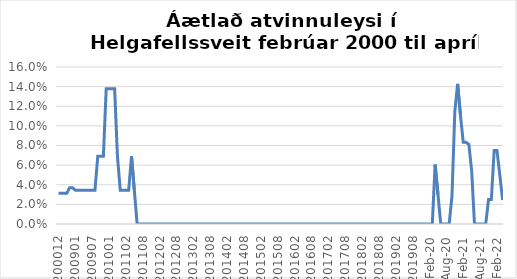
| Category | Áætlað atvinnuleysi |
|---|---|
| 200012 | 0.031 |
| 200301 | 0.031 |
| 200302 | 0.031 |
| 200303 | 0.031 |
| 200501 | 0.037 |
| 200502 | 0.037 |
| 200901 | 0.034 |
| 200902 | 0.034 |
| 200903 | 0.034 |
| 200904 | 0.034 |
| 200905 | 0.034 |
| 200906 | 0.034 |
| 200907 | 0.034 |
| 200908 | 0.034 |
| 200909 | 0.069 |
| 200910 | 0.069 |
| 200911 | 0.069 |
| 200912 | 0.138 |
| 201001 | 0.138 |
| 201002 | 0.138 |
| 201003 | 0.138 |
| 201004 | 0.069 |
| 201005 | 0.034 |
| 201006 | 0.034 |
| 201102 | 0.034 |
| 201103 | 0.034 |
| 201104 | 0.069 |
| 201105 | 0.034 |
| 201106 | 0 |
| 201107 | 0 |
| 201108 | 0 |
| 201109 | 0 |
| 201110 | 0 |
| 201111 | 0 |
| 201112 | 0 |
| 201201 | 0 |
| 201202 | 0 |
| 201203 | 0 |
| 201204 | 0 |
| 201205 | 0 |
| 201206 | 0 |
| 201207 | 0 |
| 201208 | 0 |
| 201209 | 0 |
| 201210 | 0 |
| 201211 | 0 |
| 201212 | 0 |
| 201301 | 0 |
| 201302 | 0 |
| 201303 | 0 |
| 201304 | 0 |
| 201305 | 0 |
| 201306 | 0 |
| 201307 | 0 |
| 201308 | 0 |
| 201309 | 0 |
| 201310 | 0 |
| 201311 | 0 |
| 201312 | 0 |
| 201401 | 0 |
| 201402 | 0 |
| 201403 | 0 |
| 201404 | 0 |
| 201405 | 0 |
| 201406 | 0 |
| 201407 | 0 |
| 201408 | 0 |
| 201409 | 0 |
| 201410 | 0 |
| 201411 | 0 |
| 201412 | 0 |
| 201501 | 0 |
| 201502 | 0 |
| 201503 | 0 |
| 201504 | 0 |
| 201505 | 0 |
| 201506 | 0 |
| 201507 | 0 |
| 201508 | 0 |
| 201509 | 0 |
| 201510 | 0 |
| 201511 | 0 |
| 201512 | 0 |
| 201601 | 0 |
| 201602 | 0 |
| 201603 | 0 |
| 201604 | 0 |
| 201605 | 0 |
| 201606 | 0 |
| 201607 | 0 |
| 201608 | 0 |
| 201609 | 0 |
| 201610 | 0 |
| 201611 | 0 |
| 201612 | 0 |
| 201701 | 0 |
| 201702 | 0 |
| 201703 | 0 |
| 201704 | 0 |
| 201705 | 0 |
| 201706 | 0 |
| 201707 | 0 |
| 201708 | 0 |
| 201709 | 0 |
| 201710 | 0 |
| 201711 | 0 |
| 201712 | 0 |
| 201801 | 0 |
| 201802 | 0 |
| 201803 | 0 |
| 201804 | 0 |
| 201805 | 0 |
| 201806 | 0 |
| 201807 | 0 |
| 201808 | 0 |
| 201809 | 0 |
| 201810 | 0 |
| 201811 | 0 |
| 201812 | 0 |
| 201901 | 0 |
| 201902 | 0 |
| 201903 | 0 |
| 201904 | 0 |
| 201905 | 0 |
| 201906 | 0 |
| 201907 | 0 |
| 201908 | 0 |
| 201909 | 0 |
| 201910 | 0 |
| 201911 | 0 |
| des.19 | 0 |
| jan.20 | 0 |
| feb.20 | 0 |
| mar.20 | 0 |
| apr.20 | 0.061 |
| maí.20 | 0.03 |
| jún.20 | 0 |
| júl.20 | 0 |
| ágú.20 | 0 |
| sep.20 | 0 |
| okt.20 | 0.029 |
| nóv.20 | 0.114 |
| des.20 | 0.143 |
| jan.21 | 0.111 |
| feb.21 | 0.083 |
| mar.21 | 0.083 |
| apr.21 | 0.081 |
| maí.21 | 0.054 |
| jún.21 | 0 |
| júl.21 | 0 |
| ágú.21 | 0 |
| sep.21 | 0 |
| okt.21 | 0 |
| nóv.21 | 0.025 |
| des.21 | 0.025 |
| jan.22 | 0.075 |
| feb.22 | 0.075 |
| mar.22 | 0.05 |
| apr.22 | 0.024 |